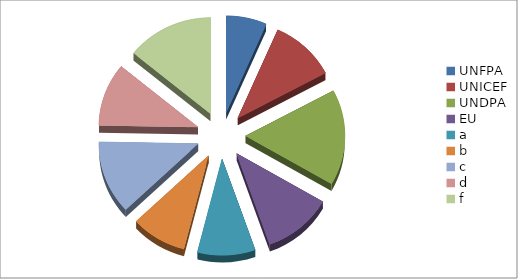
| Category | Series 0 |
|---|---|
| UNFPA | 350 |
| UNICEF | 566 |
| UNDPA | 855 |
| EU | 600 |
| a | 500 |
| b | 480 |
| c | 652 |
| d | 562 |
| f | 752 |